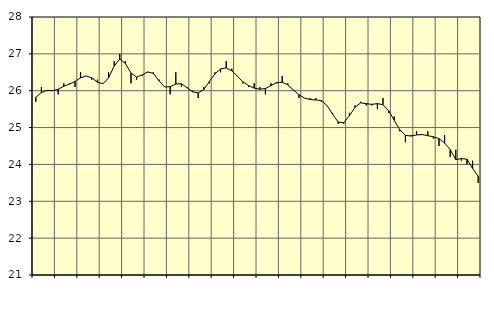
| Category | Piggar | Series 1 |
|---|---|---|
| nan | 25.7 | 25.82 |
| 1.0 | 26.1 | 25.95 |
| 1.0 | 26 | 26.01 |
| 1.0 | 26 | 26 |
| nan | 25.9 | 26.04 |
| 2.0 | 26.2 | 26.12 |
| 2.0 | 26.2 | 26.18 |
| 2.0 | 26.1 | 26.25 |
| nan | 26.5 | 26.35 |
| 3.0 | 26.4 | 26.4 |
| 3.0 | 26.3 | 26.35 |
| 3.0 | 26.3 | 26.23 |
| nan | 26.2 | 26.19 |
| 4.0 | 26.5 | 26.35 |
| 4.0 | 26.8 | 26.67 |
| 4.0 | 27 | 26.86 |
| nan | 26.8 | 26.74 |
| 5.0 | 26.2 | 26.48 |
| 5.0 | 26.3 | 26.37 |
| 5.0 | 26.4 | 26.43 |
| nan | 26.5 | 26.51 |
| 6.0 | 26.5 | 26.47 |
| 6.0 | 26.3 | 26.27 |
| 6.0 | 26.1 | 26.1 |
| nan | 25.9 | 26.11 |
| 7.0 | 26.5 | 26.18 |
| 7.0 | 26.1 | 26.19 |
| 7.0 | 26.1 | 26.08 |
| nan | 26 | 25.97 |
| 8.0 | 25.8 | 25.94 |
| 8.0 | 26.1 | 26.03 |
| 8.0 | 26.2 | 26.25 |
| nan | 26.5 | 26.46 |
| 9.0 | 26.5 | 26.59 |
| 9.0 | 26.8 | 26.62 |
| 9.0 | 26.6 | 26.54 |
| nan | 26.4 | 26.39 |
| 10.0 | 26.2 | 26.24 |
| 10.0 | 26.1 | 26.14 |
| 10.0 | 26.2 | 26.07 |
| nan | 26.1 | 26.04 |
| 11.0 | 25.9 | 26.06 |
| 11.0 | 26.2 | 26.14 |
| 11.0 | 26.2 | 26.22 |
| nan | 26.4 | 26.23 |
| 12.0 | 26.2 | 26.16 |
| 12.0 | 26 | 26.02 |
| 12.0 | 25.8 | 25.89 |
| nan | 25.8 | 25.8 |
| 13.0 | 25.8 | 25.76 |
| 13.0 | 25.8 | 25.75 |
| 13.0 | 25.7 | 25.73 |
| nan | 25.6 | 25.6 |
| 14.0 | 25.4 | 25.36 |
| 14.0 | 25.1 | 25.15 |
| 14.0 | 25.1 | 25.13 |
| nan | 25.4 | 25.32 |
| 15.0 | 25.6 | 25.55 |
| 15.0 | 25.7 | 25.67 |
| 15.0 | 25.6 | 25.65 |
| nan | 25.6 | 25.63 |
| 16.0 | 25.5 | 25.65 |
| 16.0 | 25.8 | 25.62 |
| 16.0 | 25.4 | 25.46 |
| nan | 25.3 | 25.2 |
| 17.0 | 24.9 | 24.94 |
| 17.0 | 24.6 | 24.79 |
| 17.0 | 24.8 | 24.77 |
| nan | 24.9 | 24.8 |
| 18.0 | 24.8 | 24.81 |
| 18.0 | 24.9 | 24.78 |
| 18.0 | 24.7 | 24.75 |
| nan | 24.5 | 24.7 |
| 19.0 | 24.8 | 24.58 |
| 19.0 | 24.2 | 24.4 |
| 19.0 | 24.4 | 24.13 |
| nan | 24.1 | 24.16 |
| 20.0 | 24 | 24.14 |
| 20.0 | 24.1 | 23.89 |
| 20.0 | 23.5 | 23.68 |